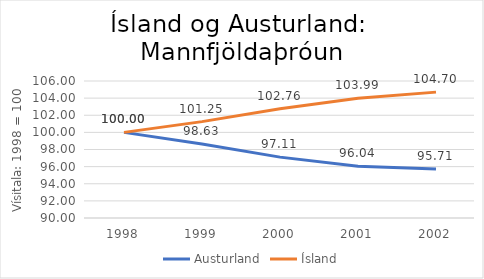
| Category | Austurland | Ísland |
|---|---|---|
| 1998.0 | 100 | 100 |
| 1999.0 | 98.632 | 101.254 |
| 2000.0 | 97.11 | 102.756 |
| 2001.0 | 96.036 | 103.991 |
| 2002.0 | 95.71 | 104.7 |